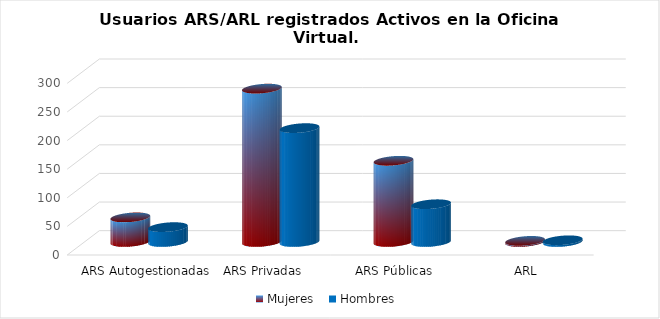
| Category | Mujeres | Hombres |
|---|---|---|
| ARS Autogestionadas | 43 | 26 |
| ARS Privadas | 268 | 199 |
| ARS Públicas | 142 | 66 |
| ARL | 2 | 3 |